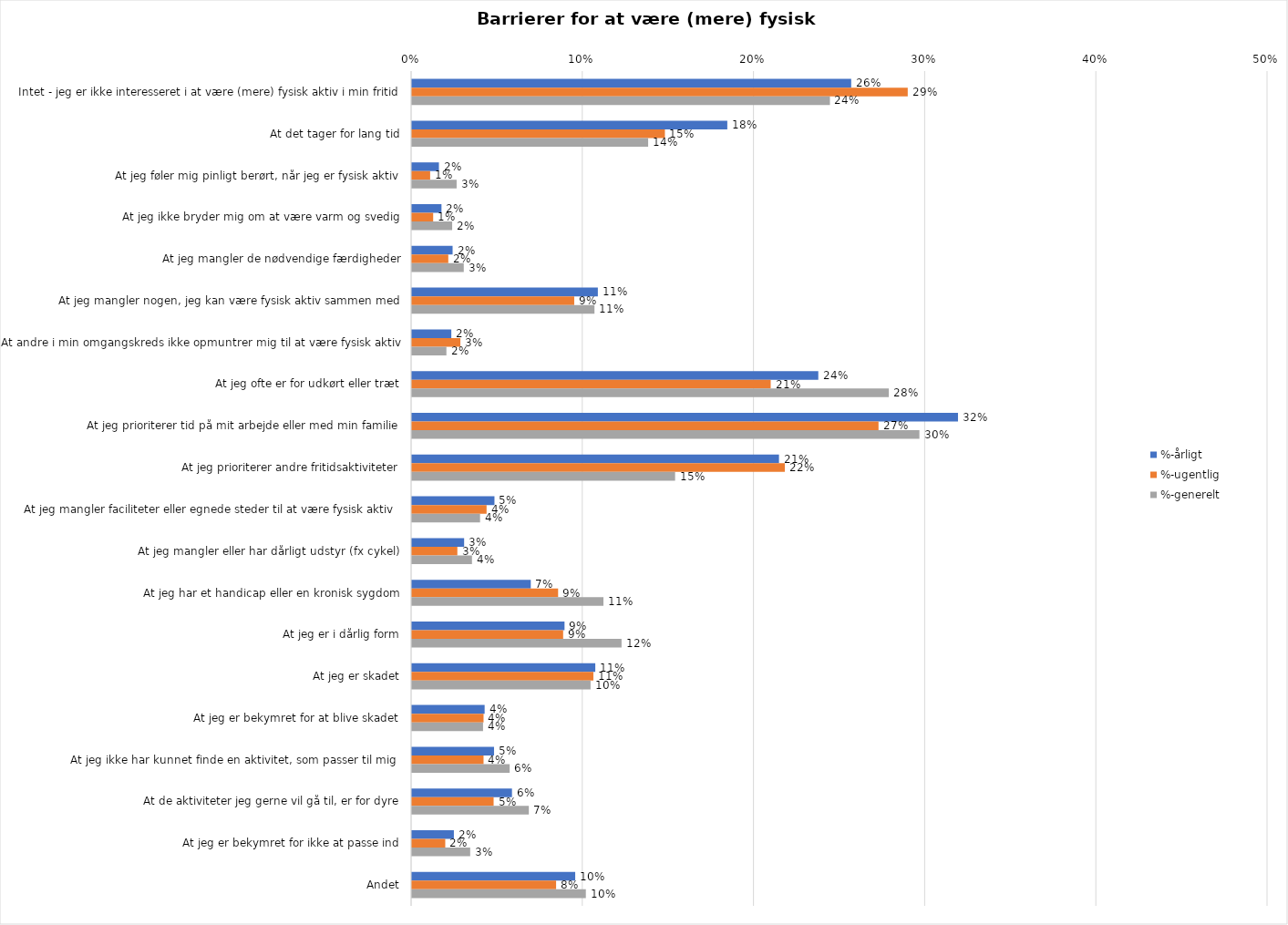
| Category | %-årligt | %-ugentlig | %-generelt |
|---|---|---|---|
| Intet - jeg er ikke interesseret i at være (mere) fysisk aktiv i min fritid | 0.257 | 0.29 | 0.244 |
| At det tager for lang tid | 0.184 | 0.148 | 0.138 |
| At jeg føler mig pinligt berørt, når jeg er fysisk aktiv | 0.016 | 0.011 | 0.026 |
| At jeg ikke bryder mig om at være varm og svedig | 0.017 | 0.012 | 0.023 |
| At jeg mangler de nødvendige færdigheder | 0.024 | 0.021 | 0.03 |
| At jeg mangler nogen, jeg kan være fysisk aktiv sammen med | 0.109 | 0.095 | 0.107 |
| At andre i min omgangskreds ikke opmuntrer mig til at være fysisk aktiv | 0.023 | 0.028 | 0.02 |
| At jeg ofte er for udkørt eller træt | 0.237 | 0.21 | 0.279 |
| At jeg prioriterer tid på mit arbejde eller med min familie | 0.319 | 0.273 | 0.296 |
| At jeg prioriterer andre fritidsaktiviteter | 0.214 | 0.218 | 0.154 |
| At jeg mangler faciliteter eller egnede steder til at være fysisk aktiv  | 0.048 | 0.044 | 0.04 |
| At jeg mangler eller har dårligt udstyr (fx cykel) | 0.03 | 0.026 | 0.035 |
| At jeg har et handicap eller en kronisk sygdom | 0.069 | 0.085 | 0.112 |
| At jeg er i dårlig form | 0.089 | 0.088 | 0.122 |
| At jeg er skadet | 0.107 | 0.106 | 0.104 |
| At jeg er bekymret for at blive skadet | 0.042 | 0.042 | 0.041 |
| At jeg ikke har kunnet finde en aktivitet, som passer til mig  | 0.048 | 0.042 | 0.057 |
| At de aktiviteter jeg gerne vil gå til, er for dyre | 0.058 | 0.048 | 0.068 |
| At jeg er bekymret for ikke at passe ind | 0.024 | 0.019 | 0.034 |
| Andet | 0.095 | 0.084 | 0.102 |